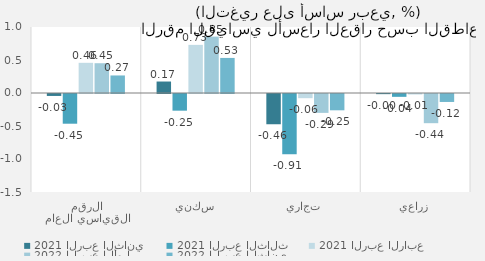
| Category | 2021 الربع الثاني | 2021 الربع الثالث | 2021 الربع الرابع | 2022 الربع الأول | 2022 الربع الثاني |
|---|---|---|---|---|---|
| الرقم القياسي العام | -0.03 | -0.45 | 0.457 | 0.451 | 0.266 |
| سكني | 0.174 | -0.253 | 0.729 | 0.854 | 0.531 |
| تجاري | -0.458 | -0.913 | -0.063 | -0.286 | -0.247 |
| زراعي | -0.002 | -0.043 | -0.008 | -0.442 | -0.121 |